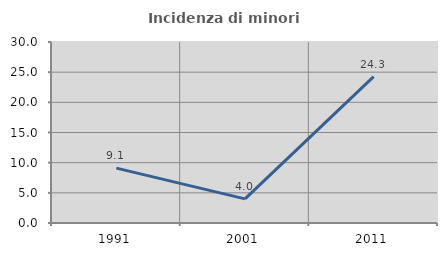
| Category | Incidenza di minori stranieri |
|---|---|
| 1991.0 | 9.091 |
| 2001.0 | 4 |
| 2011.0 | 24.265 |